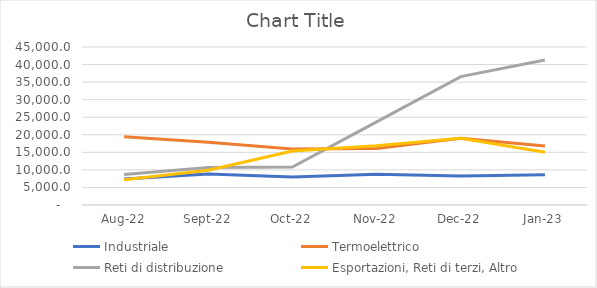
| Category | Industriale | Termoelettrico | Reti di distribuzione | Esportazioni, Reti di terzi, Altro |
|---|---|---|---|---|
| 2022-08-01 | 7433.425 | 19461.608 | 8678.039 | 7189.584 |
| 2022-09-01 | 8818.596 | 17900.355 | 10665.709 | 9902.949 |
| 2022-10-01 | 7987.997 | 15947.474 | 10820.025 | 15355.756 |
| 2022-11-01 | 8754.77 | 16066.613 | 23660.384 | 16886.936 |
| 2022-12-01 | 8258.279 | 19041.973 | 36571.098 | 18996.834 |
| 2023-01-01 | 8616.871 | 16785.236 | 41290.331 | 15005.091 |